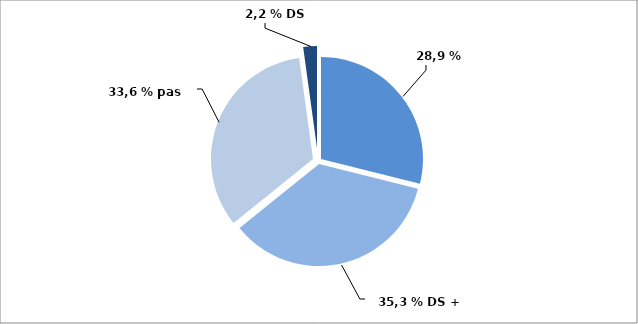
| Category | Series 0 |
|---|---|
| Élus  | 28.92 |
| Élus+ DS | 35.29 |
| Pas d'IRP  | 33.62 |
| DS seuls | 2.17 |